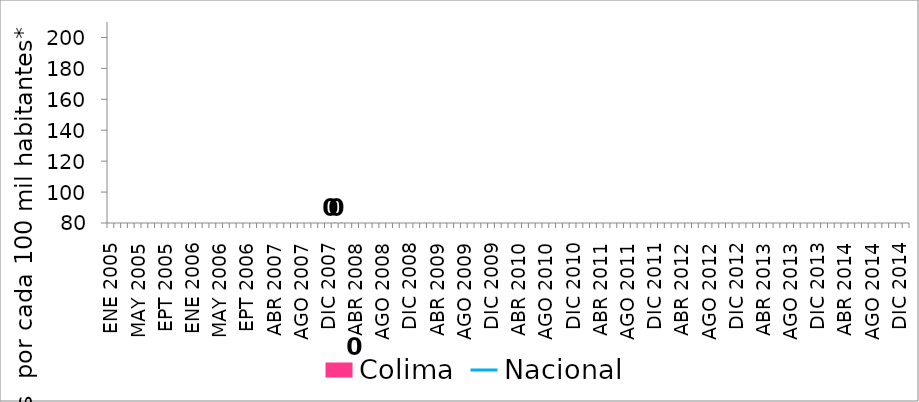
| Category | Colima |
|---|---|
| ENE 2005 | 0 |
| FEB 2005 | 0 |
| MAR 2005 | 0 |
| ABR 2005 | 0 |
| MAY 2005 | 0 |
| JUN 2005 | 0 |
| JUL 2005 | 0 |
| AGO 2005 | 0 |
| EPT 2005 | 0 |
| OCT 2005 | 0 |
| NOV 2005 | 0 |
| DIC 2005 | 0 |
| ENE 2006 | 0 |
| FEB 2006 | 0 |
| MAR 2006 | 0 |
| ABR 2006 | 0 |
| MAY 2006 | 0 |
| JUN 2006 | 0 |
| JUL 2006 | 0 |
| AGO 2006 | 0 |
| EPT 2006 | 0 |
| ENE 2007 | 0 |
| FEB 2007 | 0 |
| MAR 2007 | 0 |
| ABR 2007 | 0 |
| MAY 2007 | 0 |
| JUN 2007 | 0 |
| JUL 2007 | 0 |
| AGO 2007 | 0 |
| EPT 2007 | 0 |
| OCT 2007 | 0 |
| NOV 2007 | 0 |
| DIC 2007 | 0 |
| ENE 2008 | 0 |
| FEB 2008 | 0 |
| MAR 2008 | 0 |
| ABR 2008 | 0 |
| MAY 2008 | 0 |
| JUN 2008 | 0 |
| JUL 2008 | 0 |
| AGO 2008 | 0 |
| EPT 2008 | 0 |
| OCT 2008 | 0 |
| NOV 2008 | 0 |
| DIC 2008 | 0 |
| ENE 2009 | 0 |
| FEB 2009 | 0 |
| MAR 2009 | 0 |
| ABR 2009 | 0 |
| MAY 2009 | 0 |
| JUN 2009 | 0 |
| JUL 2009 | 0 |
| AGO 2009 | 0 |
| EPT 2009 | 0 |
| OCT 2009 | 0 |
| NOV 2009 | 0 |
| DIC 2009 | 0 |
| ENE 2010 | 0 |
| FEB 2010 | 0 |
| MAR 2010 | 0 |
| ABR 2010 | 0 |
| MAY 2010 | 0 |
| JUN 2010 | 0 |
| JUL 2010 | 0 |
| AGO 2010 | 0 |
| EPT 2010 | 0 |
| OCT 2010 | 0 |
| NOV 2010 | 0 |
| DIC 2010 | 0 |
| ENE 2011 | 0 |
| FEB 2011 | 0 |
| MAR 2011 | 0 |
| ABR 2011 | 0 |
| MAY 2011 | 0 |
| JUN 2011 | 0 |
| JUL 2011 | 0 |
| AGO 2011 | 0 |
| EPT 2011 | 0 |
| OCT 2011 | 0 |
| NOV 2011 | 0 |
| DIC 2011 | 0 |
| ENE 2011 | 0 |
| FEB 2012 | 0 |
| MAR 2012 | 0 |
| ABR 2012 | 0 |
| MAY 2012 | 0 |
| JUN 2012 | 0 |
| JUL 2012 | 0 |
| AGO 2012 | 0 |
| EPT 2012 | 0 |
| OCT 2012 | 0 |
| NOV 2012 | 0 |
| DIC 2012 | 0 |
| ENE 2013 | 0 |
| FEB 2013 | 0 |
| MAR 2013 | 0 |
| ABR 2013 | 0 |
| MAY 2013 | 0 |
| JUN 2013 | 0 |
| JUL 2013 | 0 |
| AGO 2013 | 0 |
| EPT 2013 | 0 |
| OCT 2013 | 0 |
| NOV 2013 | 0 |
| DIC 2013 | 0 |
| ENE 2014 | 0 |
| FEB 2014 | 0 |
| MAR 2014 | 0 |
| ABR 2014 | 0 |
| MAY 2014 | 0 |
| JUN 2014 | 0 |
| JUL 2014 | 0 |
| AGO 2014 | 0 |
| EPT 2014 | 0 |
| OCT 2014 | 0 |
| NOV 2014 | 0 |
| DIC 2014 | 0 |
| ENE 2015 | 0 |